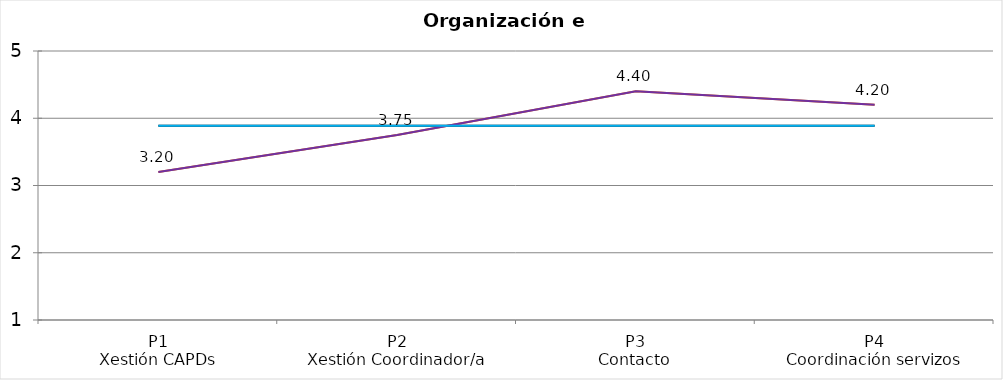
| Category | Valoración (1-5) | MEDIA |
|---|---|---|
| P1
Xestión CAPDs | 3.2 | 3.888 |
| P2
Xestión Coordinador/a | 3.75 | 3.888 |
| P3
Contacto | 4.4 | 3.888 |
| P4
Coordinación servizos | 4.2 | 3.888 |